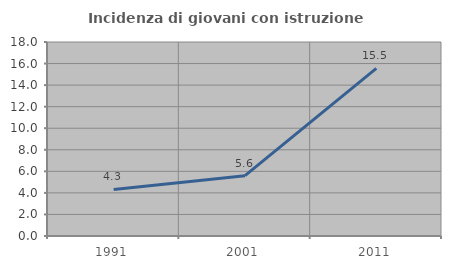
| Category | Incidenza di giovani con istruzione universitaria |
|---|---|
| 1991.0 | 4.323 |
| 2001.0 | 5.596 |
| 2011.0 | 15.547 |